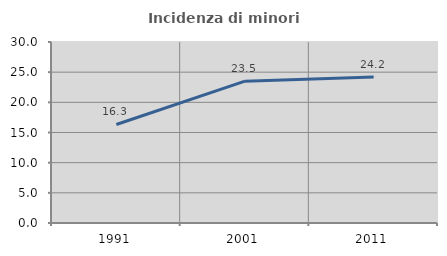
| Category | Incidenza di minori stranieri |
|---|---|
| 1991.0 | 16.327 |
| 2001.0 | 23.512 |
| 2011.0 | 24.201 |